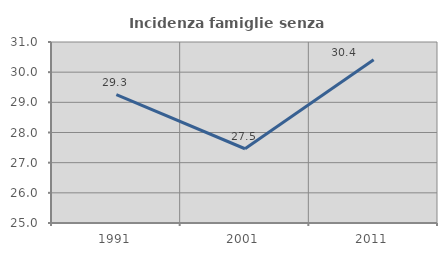
| Category | Incidenza famiglie senza nuclei |
|---|---|
| 1991.0 | 29.254 |
| 2001.0 | 27.461 |
| 2011.0 | 30.415 |